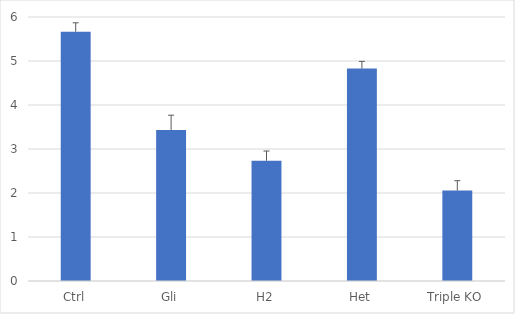
| Category | Series 0 |
|---|---|
| Ctrl | 5.666 |
| Gli | 3.433 |
| H2 | 2.733 |
| Het | 4.828 |
| Triple KO | 2.055 |